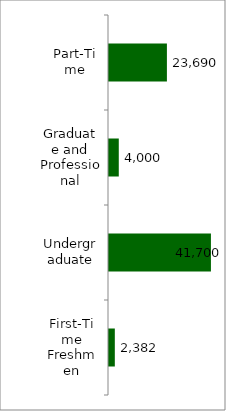
| Category | 50 states and D.C. |
|---|---|
| First-Time Freshmen | 2382 |
| Undergraduate | 41700 |
| Graduate and Professional | 4000 |
| Part-Time | 23690 |